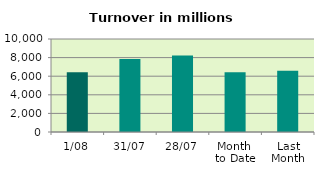
| Category | Series 0 |
|---|---|
| 1/08 | 6436.492 |
| 31/07 | 7861.93 |
| 28/07 | 8234.224 |
| Month 
to Date | 6436.492 |
| Last
Month | 6596.564 |